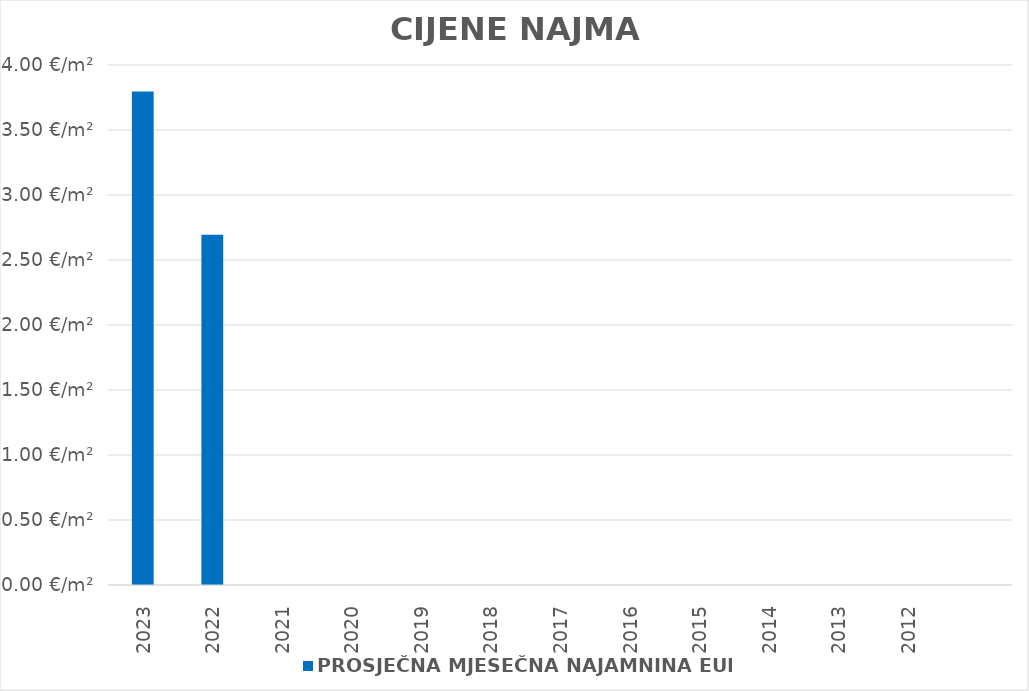
| Category | PROSJEČNA MJESEČNA NAJAMNINA EUR/m² |
|---|---|
| 2023 | 1900-01-03 19:07:14 |
| 2022 | 1900-01-02 16:40:24 |
| 2021 | 0 |
| 2020 | 0 |
| 2019 | 0 |
| 2018 | 0 |
| 2017 | 0 |
| 2016 | 0 |
| 2015 | 0 |
| 2014 | 0 |
| 2013 | 0 |
| 2012 | 0 |